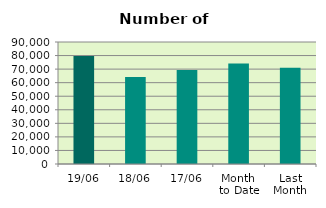
| Category | Series 0 |
|---|---|
| 19/06 | 79732 |
| 18/06 | 64186 |
| 17/06 | 69404 |
| Month 
to Date | 74213.6 |
| Last
Month | 71072.3 |